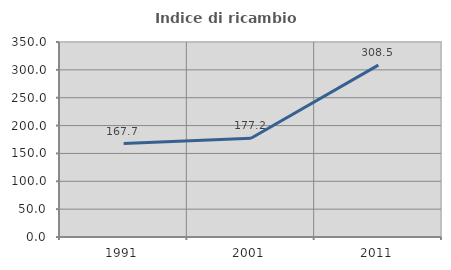
| Category | Indice di ricambio occupazionale  |
|---|---|
| 1991.0 | 167.708 |
| 2001.0 | 177.215 |
| 2011.0 | 308.475 |